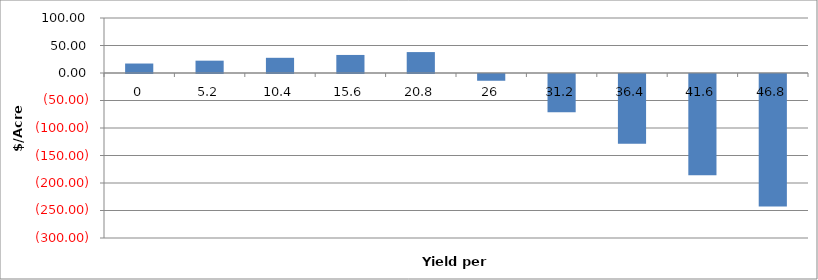
| Category | Series 0 |
|---|---|
| 0.0 | 17.225 |
| 5.2 | 22.425 |
| 10.4 | 27.625 |
| 15.6 | 32.825 |
| 20.8 | 38.025 |
| 26.0 | -12.275 |
| 31.2 | -69.475 |
| 36.4 | -126.675 |
| 41.6 | -183.875 |
| 46.800000000000004 | -241.075 |